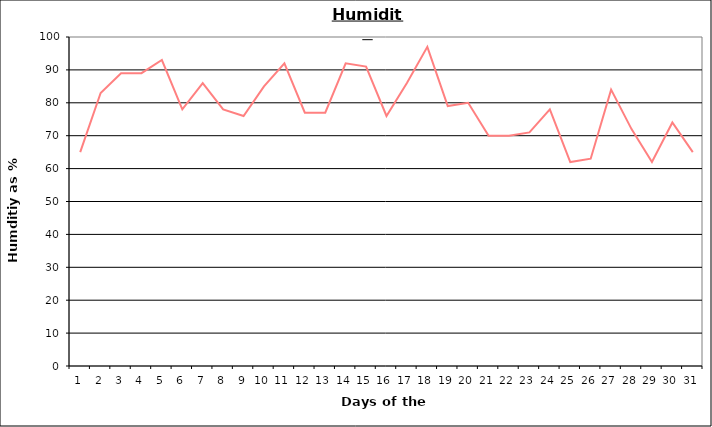
| Category | Series 0 |
|---|---|
| 0 | 65 |
| 1 | 83 |
| 2 | 89 |
| 3 | 89 |
| 4 | 93 |
| 5 | 78 |
| 6 | 86 |
| 7 | 78 |
| 8 | 76 |
| 9 | 85 |
| 10 | 92 |
| 11 | 77 |
| 12 | 77 |
| 13 | 92 |
| 14 | 91 |
| 15 | 76 |
| 16 | 86 |
| 17 | 97 |
| 18 | 79 |
| 19 | 80 |
| 20 | 70 |
| 21 | 70 |
| 22 | 71 |
| 23 | 78 |
| 24 | 62 |
| 25 | 63 |
| 26 | 84 |
| 27 | 72 |
| 28 | 62 |
| 29 | 74 |
| 30 | 65 |